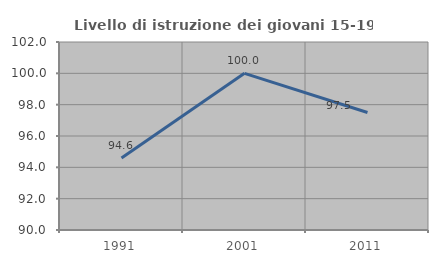
| Category | Livello di istruzione dei giovani 15-19 anni |
|---|---|
| 1991.0 | 94.595 |
| 2001.0 | 100 |
| 2011.0 | 97.5 |